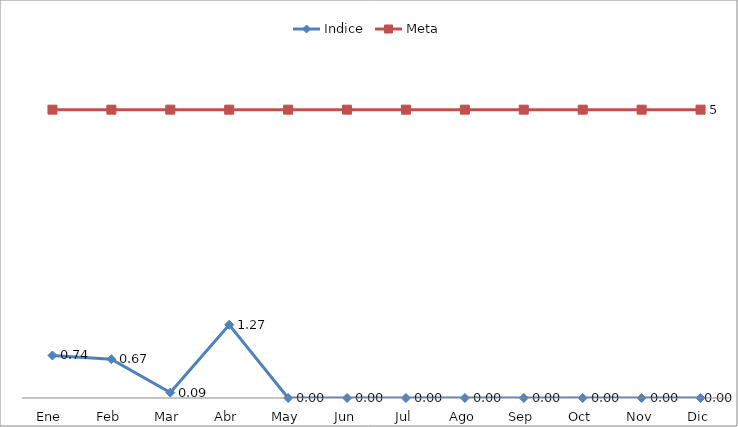
| Category | Indice | Meta |
|---|---|---|
| Ene | 0.737 | 5 |
| Feb | 0.673 | 5 |
| Mar | 0.094 | 5 |
| Abr | 1.27 | 5 |
| May | 0 | 5 |
| Jun | 0 | 5 |
| Jul | 0 | 5 |
| Ago | 0 | 5 |
| Sep | 0 | 5 |
| Oct | 0 | 5 |
| Nov | 0 | 5 |
| Dic | 0 | 5 |